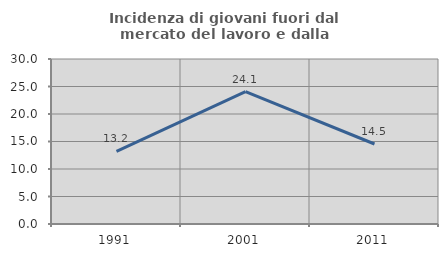
| Category | Incidenza di giovani fuori dal mercato del lavoro e dalla formazione  |
|---|---|
| 1991.0 | 13.22 |
| 2001.0 | 24.064 |
| 2011.0 | 14.545 |